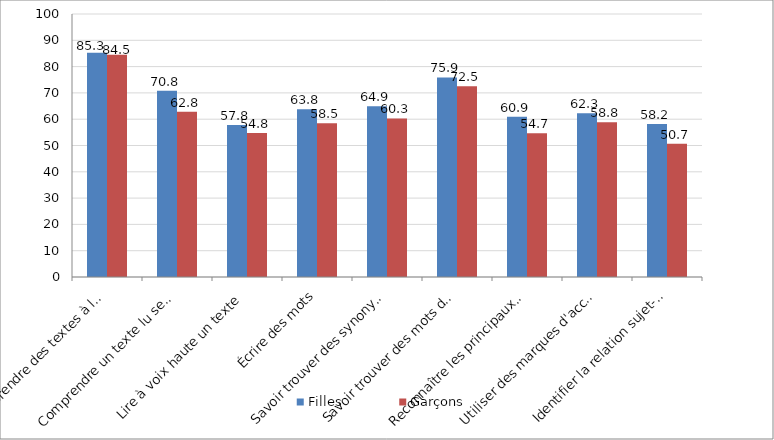
| Category | Filles | Garçons |
|---|---|---|
| Comprendre des textes à l'oral | 85.3 | 84.5 |
| Comprendre un texte lu seul(e) | 70.8 | 62.8 |
| Lire à voix haute un texte | 57.8 | 54.8 |
| Écrire des mots | 63.8 | 58.5 |
| Savoir trouver des synonymes | 64.9 | 60.3 |
| Savoir trouver des mots de la même famille | 75.9 | 72.5 |
| Reconnaître les principaux constituants de la phrase | 60.9 | 54.7 |
| Utiliser des marques d'accord pour les noms et adjectifs | 62.3 | 58.8 |
| Identifier la relation sujet-verbe | 58.2 | 50.7 |